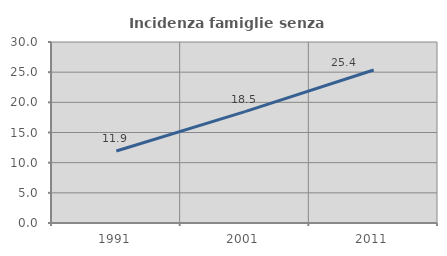
| Category | Incidenza famiglie senza nuclei |
|---|---|
| 1991.0 | 11.935 |
| 2001.0 | 18.454 |
| 2011.0 | 25.361 |